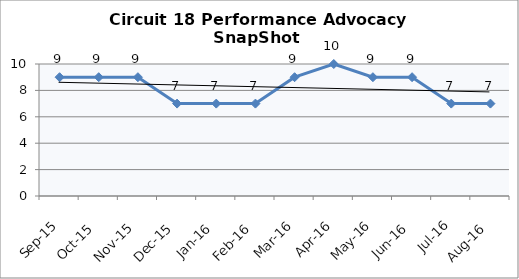
| Category | Circuit 18 |
|---|---|
| Sep-15 | 9 |
| Oct-15 | 9 |
| Nov-15 | 9 |
| Dec-15 | 7 |
| Jan-16 | 7 |
| Feb-16 | 7 |
| Mar-16 | 9 |
| Apr-16 | 10 |
| May-16 | 9 |
| Jun-16 | 9 |
| Jul-16 | 7 |
| Aug-16 | 7 |